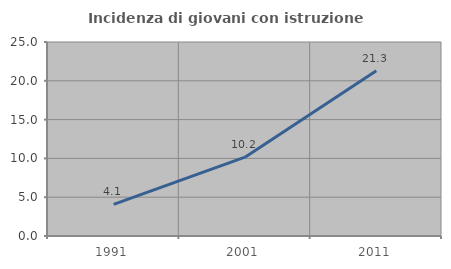
| Category | Incidenza di giovani con istruzione universitaria |
|---|---|
| 1991.0 | 4.065 |
| 2001.0 | 10.156 |
| 2011.0 | 21.302 |